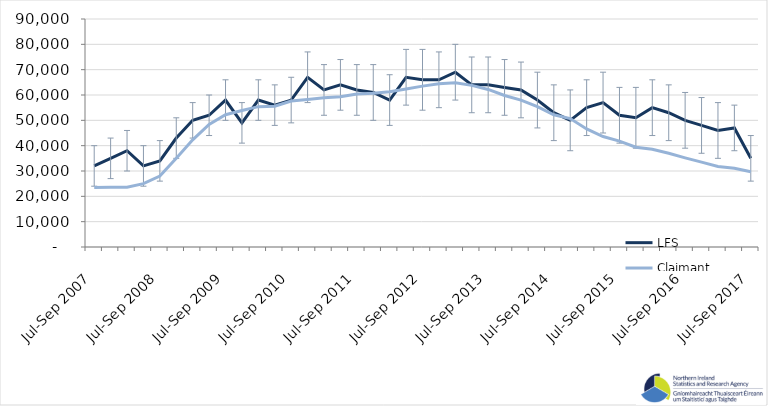
| Category | LFS | Claimant Count |
|---|---|---|
| Jul-Sep 2007 | 32000 | 23500 |
| Oct-Dec 2007 | 35000 | 23600 |
| Jan-Mar 2008 | 38000 | 23600 |
| Apr-Jun 2008 | 32000 | 25000 |
| Jul-Sep 2008 | 34000 | 28000 |
| Oct-Dec 2008 | 43000 | 35000 |
| Jan-Mar 2009 | 50000 | 42300 |
| Apr-Jun 2009 | 52000 | 48400 |
| Jul-Sep 2009 | 58000 | 52200 |
| Oct-Dec 2009 | 49000 | 53900 |
| Jan-Mar 2010 | 58000 | 55400 |
| Apr-Jun 2010 | 56000 | 55600 |
| Jul-Sep 2010 | 58000 | 57600 |
| Oct-Dec 2010 | 67000 | 58200 |
| Jan-Mar 2011 | 62000 | 58900 |
| Apr-Jun 2011 | 64000 | 59300 |
| Jul-Sep 2011 | 62000 | 60400 |
| Oct-Dec 2011 | 61000 | 60700 |
| Jan-Mar 2012 | 58000 | 61300 |
| Apr-Jun 2012 | 67000 | 62400 |
| Jul-Sep 2012 | 66000 | 63500 |
| Oct-Dec 2012 | 66000 | 64400 |
| Jan-Mar 2013 | 69000 | 64800 |
| Apr-Jun 2013 | 64000 | 63800 |
| Jul-Sep 2013 | 64000 | 62200 |
| Oct-Dec 2013 | 63000 | 59800 |
| Jan-Mar 2014 | 62000 | 58000 |
| Apr-Jun 2014 | 58000 | 55400 |
| Jul-Sep 2014 | 53000 | 52200 |
| Oct-Dec 2014 | 50000 | 50700 |
| Jan-Mar 2015 | 55000 | 46600 |
| Apr-Jun 2015 | 57000 | 43600 |
| Jul-Sep 2015 | 52000 | 41800 |
| Oct-Dec 2015 | 51000 | 39400 |
| Jan-Mar 2016 | 55000 | 38600 |
| Apr-Jun 2016 | 53000 | 37000 |
| Jul-Sep 2016 | 50000 | 35200 |
| Oct-Dec 2016 | 48000 | 33500 |
| Jan-Mar 2017 | 46000 | 31800 |
| Apr-Jun 2017 | 47000 | 31100 |
| Jul-Sep 2017 | 35000 | 29700 |